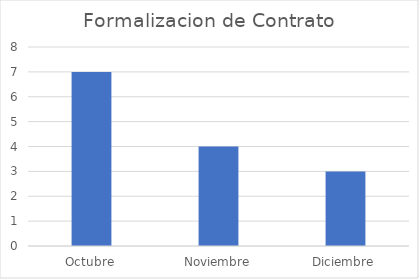
| Category | Formalizacion de Contrato |
|---|---|
| Octubre | 7 |
| Noviembre | 4 |
| Diciembre | 3 |